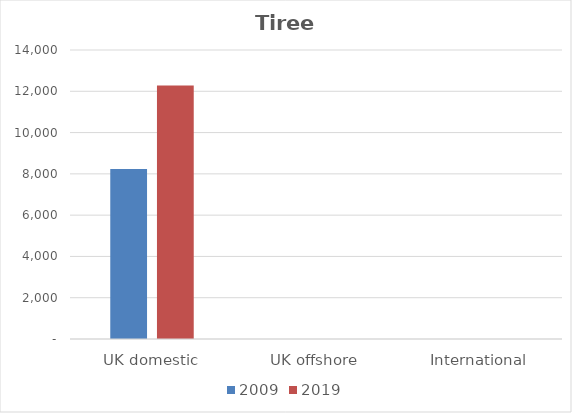
| Category | 2009 | 2019 |
|---|---|---|
| UK domestic | 8230 | 12278 |
| UK offshore | 0 | 0 |
| International | 0 | 0 |